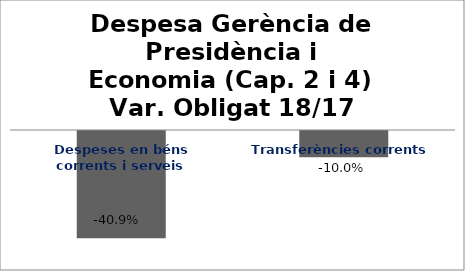
| Category | Series 0 |
|---|---|
| Despeses en béns corrents i serveis | -0.409 |
| Transferències corrents | -0.1 |